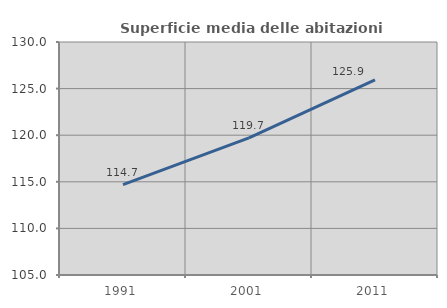
| Category | Superficie media delle abitazioni occupate |
|---|---|
| 1991.0 | 114.687 |
| 2001.0 | 119.71 |
| 2011.0 | 125.926 |